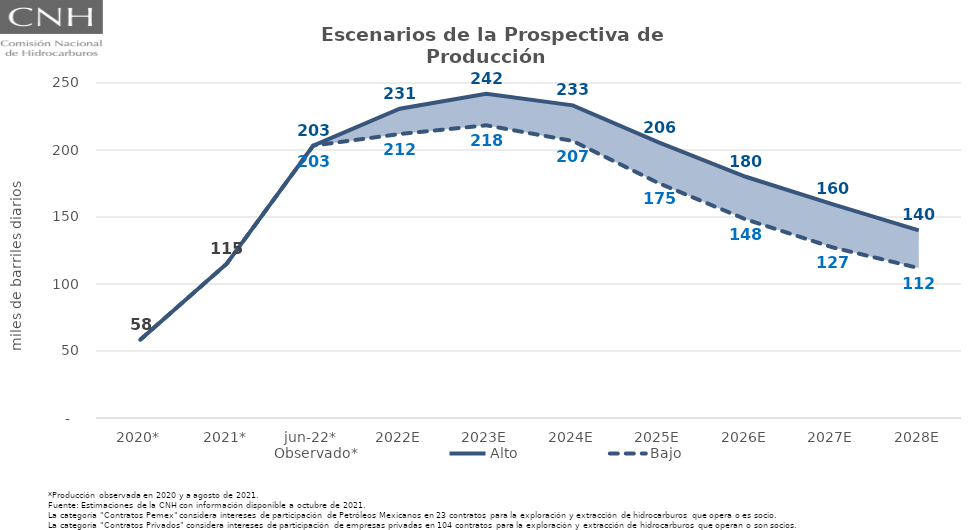
| Category | Observado* | Alto | Bajo |
|---|---|---|---|
| 2020* | 58.421 | 58.421 | 58.421 |
| 2021* | 115.166 | 115.166 | 115.166 |
| jun-22* | 203.259 | 203.259 | 203.259 |
| 2022E | 216.81 | 230.82 | 211.938 |
| 2023E | 223.922 | 242.007 | 218.43 |
| 2024E | 214.023 | 233.291 | 206.725 |
| 2025E | 186.027 | 205.534 | 175.078 |
| 2026E | 161.721 | 180.041 | 148.259 |
| 2027E | 142.105 | 159.589 | 127.407 |
| 2028E | 127.344 | 139.966 | 111.862 |